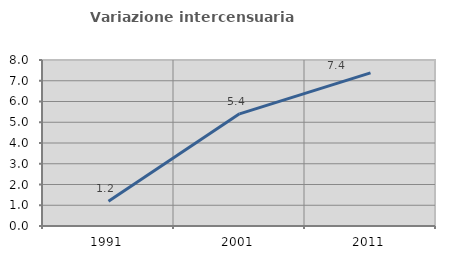
| Category | Variazione intercensuaria annua |
|---|---|
| 1991.0 | 1.196 |
| 2001.0 | 5.406 |
| 2011.0 | 7.378 |